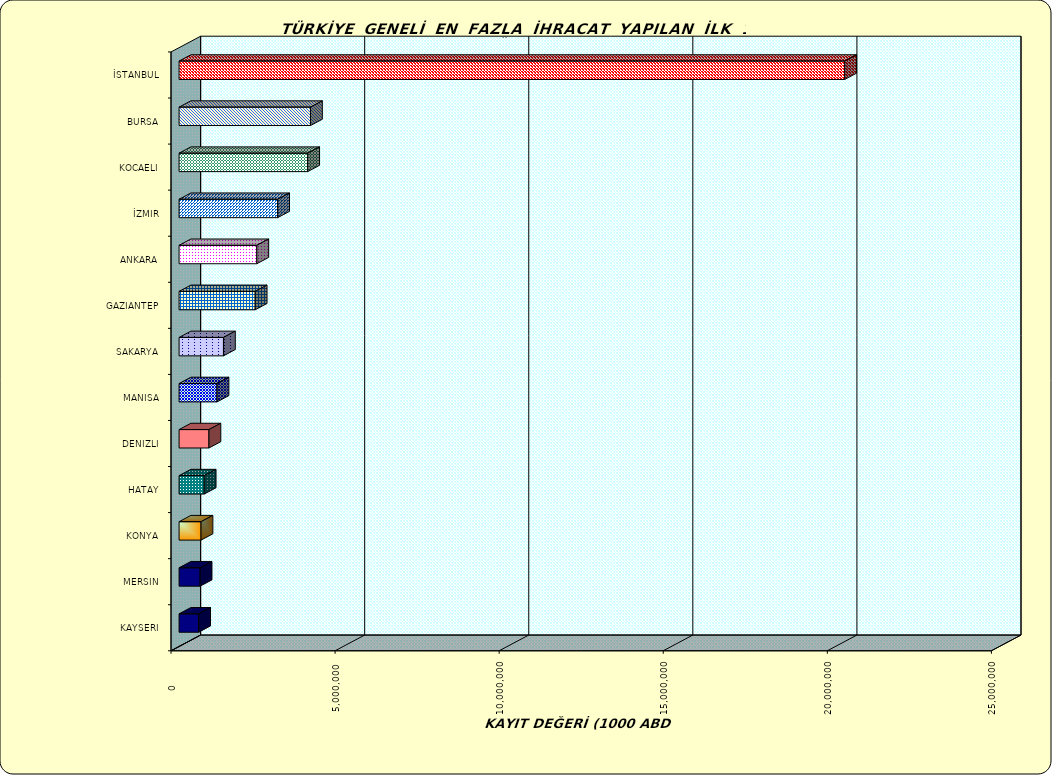
| Category | Series 0 |
|---|---|
| İSTANBUL | 20283838.637 |
| BURSA | 4004442.465 |
| KOCAELI | 3920046.286 |
| İZMIR | 3004452.349 |
| ANKARA | 2369246.962 |
| GAZIANTEP | 2319591.059 |
| SAKARYA | 1352262.668 |
| MANISA | 1155724.661 |
| DENIZLI | 909997.396 |
| HATAY | 765249.468 |
| KONYA | 668708.844 |
| MERSIN | 640648.915 |
| KAYSERI | 596443.662 |